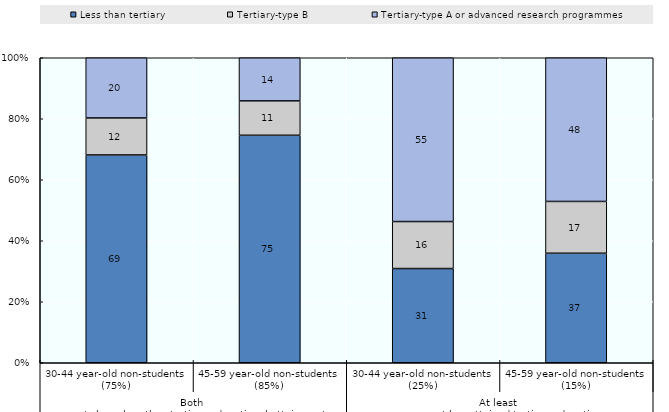
| Category | Less than tertiary | Tertiary-type B | Tertiary-type A or advanced research programmes |
|---|---|---|---|
| 0 | 68.701 | 12.234 | 19.908 |
| 1 | 75.169 | 11.364 | 14.251 |
| 2 | 31.388 | 15.663 | 54.569 |
| 3 | 36.798 | 17.408 | 48.281 |